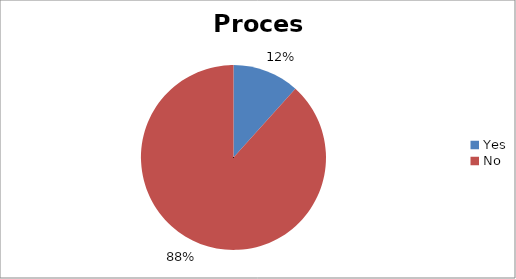
| Category | Process |
|---|---|
| Yes | 7 |
| No | 53 |